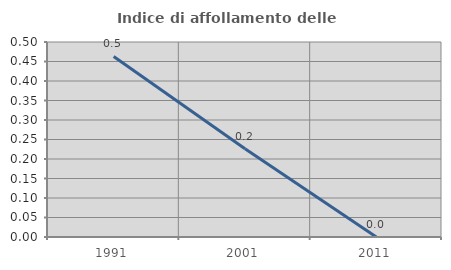
| Category | Indice di affollamento delle abitazioni  |
|---|---|
| 1991.0 | 0.463 |
| 2001.0 | 0.226 |
| 2011.0 | 0 |